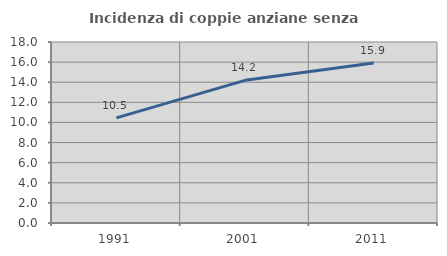
| Category | Incidenza di coppie anziane senza figli  |
|---|---|
| 1991.0 | 10.45 |
| 2001.0 | 14.186 |
| 2011.0 | 15.904 |